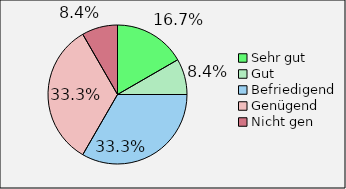
| Category | Series 0 |
|---|---|
| Sehr gut | 16.667 |
| Gut | 8.333 |
| Befriedigend | 33.333 |
| Genügend | 33.333 |
| Nicht gen | 8.333 |